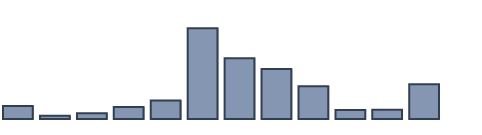
| Category | Series 0 |
|---|---|
| 0 | 3.848 |
| 1 | 0.985 |
| 2 | 1.7 |
| 3 | 3.554 |
| 4 | 5.461 |
| 5 | 26.69 |
| 6 | 17.867 |
| 7 | 14.708 |
| 8 | 9.608 |
| 9 | 2.653 |
| 10 | 2.704 |
| 11 | 10.223 |
| 12 | 0 |